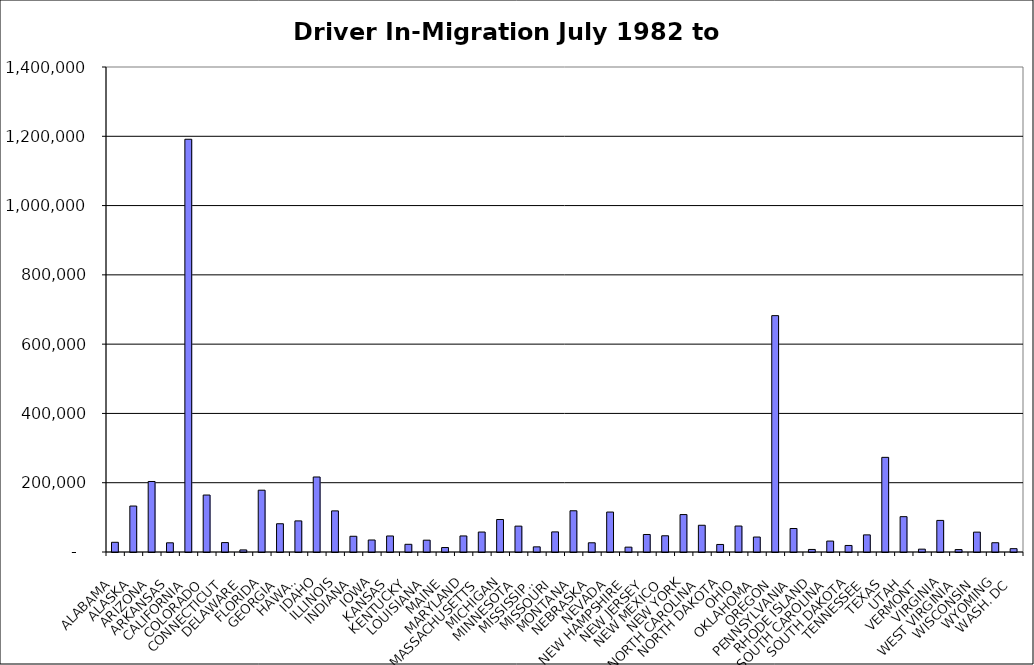
| Category | Series 0 |
|---|---|
| ALABAMA | 28034.5 |
| ALASKA | 132650.5 |
| ARIZONA | 203533 |
| ARKANSAS | 26551.5 |
| CALIFORNIA | 1191402.5 |
| COLORADO | 164445 |
| CONNECTICUT | 27183 |
| DELAWARE | 6003.5 |
| FLORIDA | 178427 |
| GEORGIA | 81569 |
| HAWAII | 89768.5 |
| IDAHO | 216510.5 |
| ILLINOIS | 118671.5 |
| INDIANA | 45378 |
| IOWA | 34672.5 |
| KANSAS | 46234.5 |
| KENTUCKY | 22199 |
| LOUISIANA | 34136.5 |
| MAINE | 12880.5 |
| MARYLAND | 46334 |
| MASSACHUSETTS | 57636 |
| MICHIGAN | 93785 |
| MINNESOTA | 74667.5 |
| MISSISSIPPI | 14857 |
| MISSOURI | 58029 |
| MONTANA | 118983 |
| NEBRASKA | 26604.5 |
| NEVADA | 115298 |
| NEW HAMPSHIRE | 14018.5 |
| NEW JERSEY | 50557 |
| NEW MEXICO | 46827 |
| NEW YORK | 108049 |
| NORTH CAROLINA | 77181.5 |
| NORTH DAKOTA | 21781.5 |
| OHIO | 74958.5 |
| OKLAHOMA | 43191 |
| OREGON | 682318 |
| PENNSYLVANIA | 67833.5 |
| RHODE ISLAND | 7375 |
| SOUTH CAROLINA | 31545.5 |
| SOUTH DAKOTA | 18874.5 |
| TENNESSEE | 49420.5 |
| TEXAS | 273201 |
| UTAH | 102012.5 |
| VERMONT | 8236 |
| VIRGINIA | 91197 |
| WEST VIRGINIA | 6950.5 |
| WISCONSIN | 57338.5 |
| WYOMING | 26774 |
| WASH. DC | 9638 |